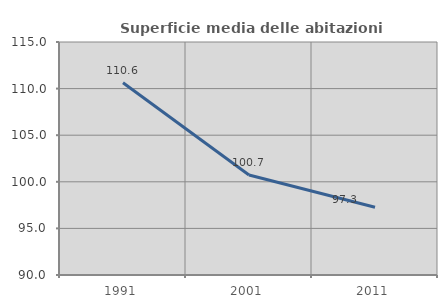
| Category | Superficie media delle abitazioni occupate |
|---|---|
| 1991.0 | 110.624 |
| 2001.0 | 100.73 |
| 2011.0 | 97.263 |